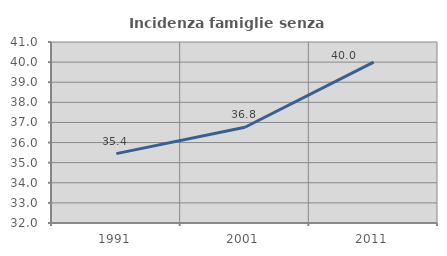
| Category | Incidenza famiglie senza nuclei |
|---|---|
| 1991.0 | 35.45 |
| 2001.0 | 36.76 |
| 2011.0 | 40 |